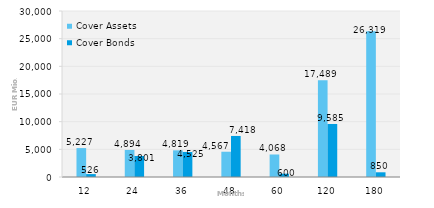
| Category | Cover Assets | Cover Bonds |
|---|---|---|
| 12.0 | 5227.394 | 525.723 |
| 24.0 | 4893.998 | 3800.5 |
| 36.0 | 4819.128 | 4525 |
| 48.0 | 4566.626 | 7417.592 |
| 60.0 | 4068.247 | 600 |
| 120.0 | 17488.564 | 9585.165 |
| 180.0 | 26319.039 | 850 |